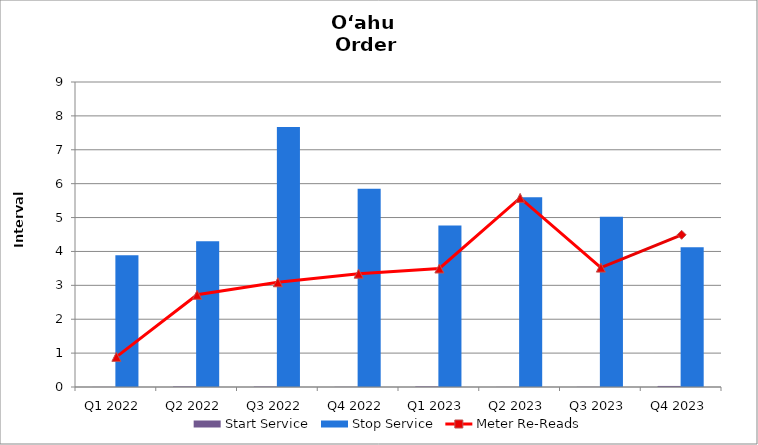
| Category | Start Service | Stop Service |
|---|---|---|
| Q1 2022 | 0.003 | 3.888 |
| Q2 2022 | 0.018 | 4.303 |
| Q3 2022 | 0.014 | 7.673 |
| Q4 2022 | 0.006 | 5.852 |
| Q1 2023 | 0.017 | 4.765 |
| Q2 2023 | 0.003 | 5.596 |
| Q3 2023 | 0.005 | 5.025 |
| Q4 2023 | 0.031 | 4.125 |